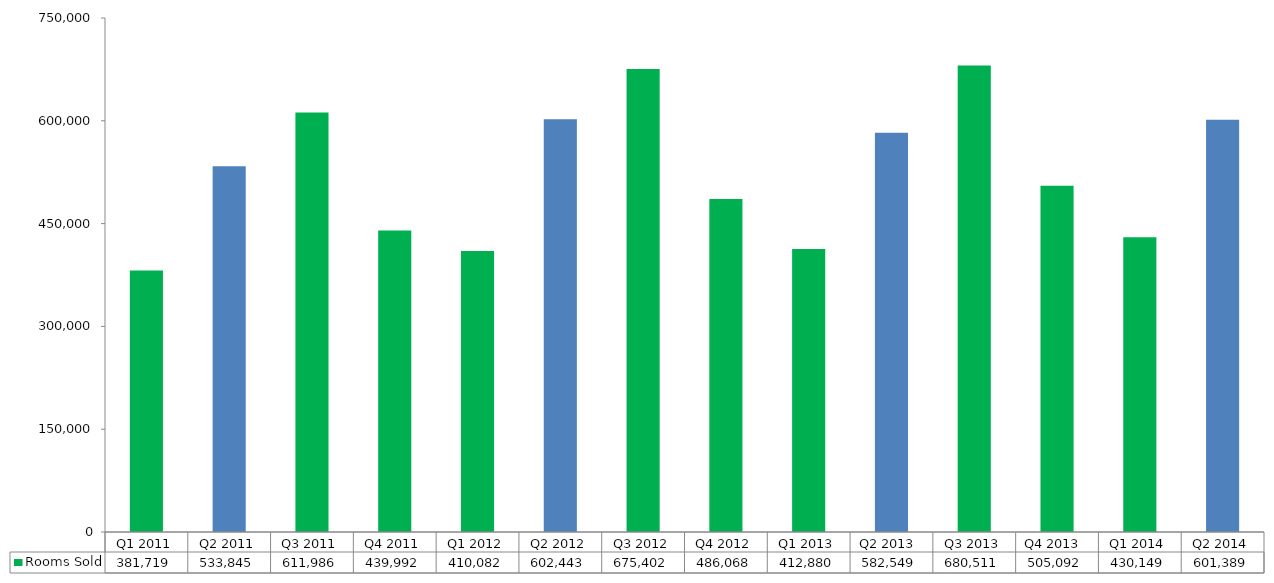
| Category | Rooms Sold |
|---|---|
| Q1 2011 | 381718.635 |
| Q2 2011 | 533845.014 |
| Q3 2011 | 611985.611 |
| Q4 2011 | 439991.638 |
| Q1 2012 | 410081.871 |
| Q2 2012 | 602442.999 |
| Q3 2012 | 675401.549 |
| Q4 2012 | 486068.155 |
| Q1 2013 | 412879.548 |
| Q2 2013  | 582549.306 |
| Q3 2013 | 680511.485 |
| Q4 2013  | 505092.425 |
| Q1 2014 | 430148.859 |
| Q2 2014 | 601389.045 |